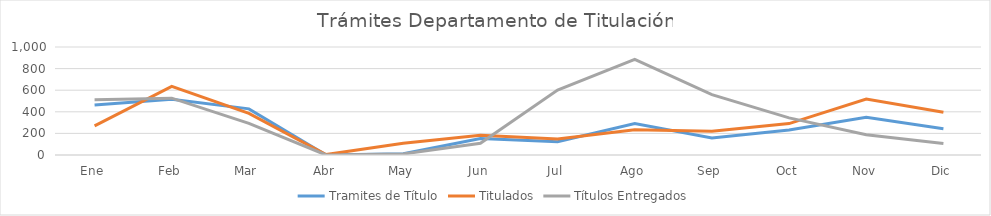
| Category | Tramites de Título | Titulados | Títulos Entregados |
|---|---|---|---|
| Ene | 463 | 270 | 512 |
| Feb | 517 | 635 | 526 |
| Mar | 427 | 386 | 293 |
| Abr | 0 | 4 | 0 |
| May | 11 | 109 | 10 |
| Jun | 152 | 182 | 109 |
| Jul | 123 | 148 | 601 |
| Ago | 292 | 233 | 885 |
| Sep | 158 | 220 | 559 |
| Oct | 232 | 291 | 344 |
| Nov | 350 | 518 | 188 |
| Dic | 244 | 396 | 106 |